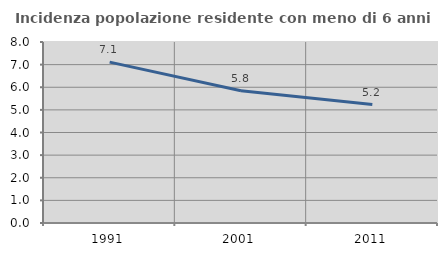
| Category | Incidenza popolazione residente con meno di 6 anni |
|---|---|
| 1991.0 | 7.11 |
| 2001.0 | 5.843 |
| 2011.0 | 5.237 |